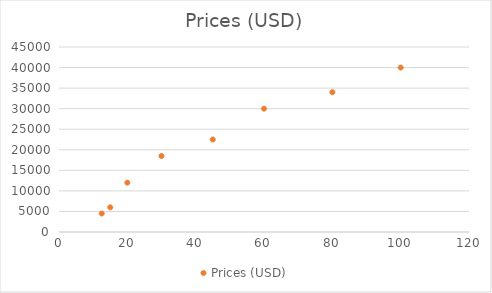
| Category | Prices (USD) |
|---|---|
| 12.5 | 4500 |
| 15.0 | 6000 |
| 20.0 | 12000 |
| 30.0 | 18500 |
| 45.0 | 22500 |
| 60.0 | 30000 |
| 80.0 | 34000 |
| 100.0 | 40000 |